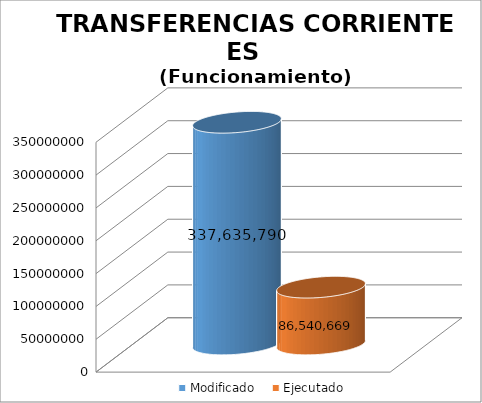
| Category | Modificado | Ejecutado |
|---|---|---|
| 0 | 337635790 | 86540668.63 |